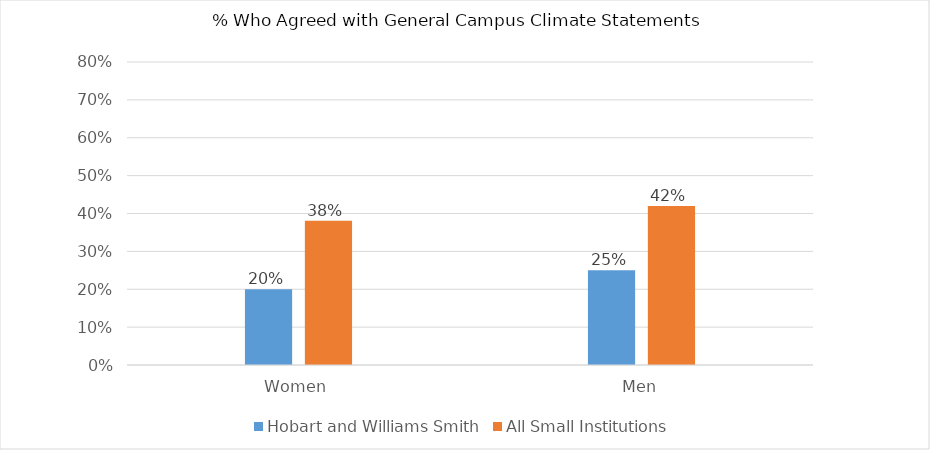
| Category | Hobart and Williams Smith | All Small Institutions |
|---|---|---|
| Women | 0.2 | 0.381 |
| Men | 0.25 | 0.42 |